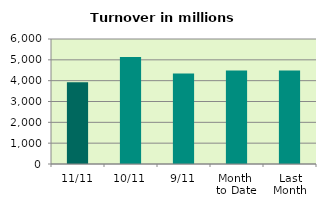
| Category | Series 0 |
|---|---|
| 11/11 | 3928.88 |
| 10/11 | 5133.746 |
| 9/11 | 4341.268 |
| Month 
to Date | 4482.196 |
| Last
Month | 4491.272 |